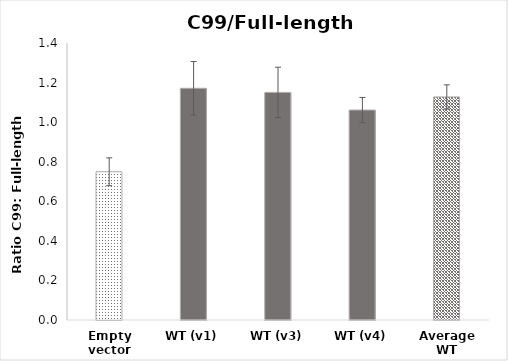
| Category | Series 0 |
|---|---|
| Empty vector | 0.749 |
| WT (v1) | 1.171 |
| WT (v3) | 1.15 |
| WT (v4) | 1.061 |
| Average WT | 1.127 |